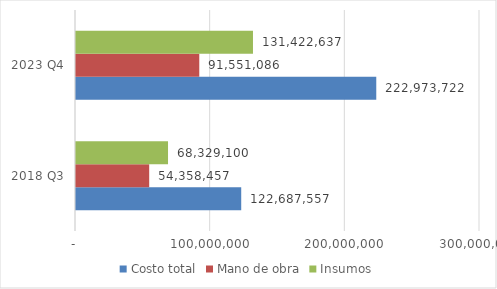
| Category | Costo total | Mano de obra | Insumos |
|---|---|---|---|
| 2018 Q3 | 122687557.143 | 54358457.143 | 68329100 |
| 2023 Q4 | 222973722.466 | 91551085.714 | 131422636.752 |